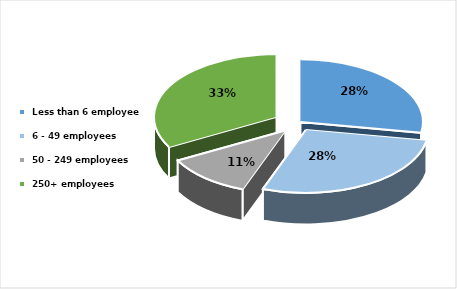
| Category | Series 0 |
|---|---|
|  Less than 6 employees | 0.277 |
|  6 - 49 employees | 0.279 |
|  50 - 249 employees | 0.114 |
|  250+ employees | 0.33 |